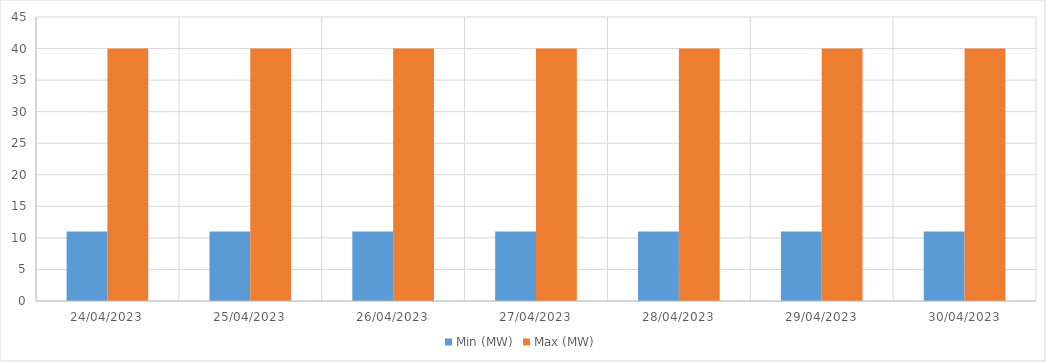
| Category | Min (MW) | Max (MW) |
|---|---|---|
| 24/04/2023 | 11 | 40 |
| 25/04/2023 | 11 | 40 |
| 26/04/2023 | 11 | 40 |
| 27/04/2023 | 11 | 40 |
| 28/04/2023 | 11 | 40 |
| 29/04/2023 | 11 | 40 |
| 30/04/2023 | 11 | 40 |